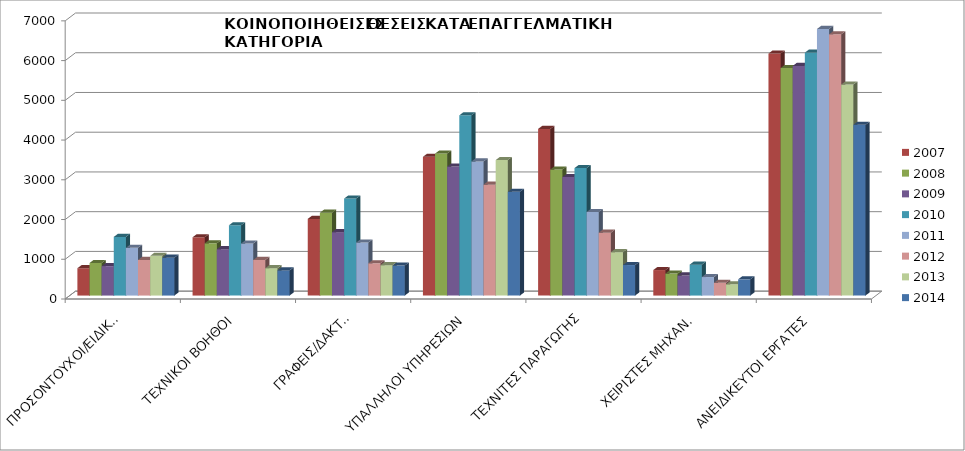
| Category | 2007 | 2008 | 2009 | 2010 | 2011 | 2012 | 2013 | 2014 |
|---|---|---|---|---|---|---|---|---|
| ΠΡΟΣΟΝΤΟΥΧΟΙ/ΕΙΔΙΚΟΙ | 688 | 819 | 741 | 1476 | 1201 | 896 | 999 | 952 |
| ΤΕΧΝΙΚΟΙ ΒΟΗΘΟΙ | 1467 | 1315 | 1167 | 1769 | 1310 | 895 | 690 | 634 |
| ΓΡΑΦΕΙΣ/ΔΑΚΤ.Ι | 1929 | 2084 | 1596 | 2442 | 1335 | 812 | 765 | 755 |
| ΥΠΑΛΛΗΛΟΙ ΥΠΗΡΕΣΙΩΝ | 3492 | 3573 | 3246 | 4536 | 3374 | 2791 | 3410 | 2611 |
| ΤΕΧΝΙΤΕΣ ΠΑΡΑΓΩΓΗΣ | 4193 | 3170 | 2981 | 3208 | 2101 | 1582 | 1092 | 768 |
| ΧΕΙΡΙΣΤΕΣ ΜΗΧΑΝ. | 642 | 553 | 505 | 778 | 466 | 321 | 284 | 408 |
| ΑΝΕΙΔΙΚΕΥΤΟΙ ΕΡΓΑΤΕΣ | 6090 | 5726 | 5780 | 6114 | 6709 | 6575 | 5311 | 4297 |